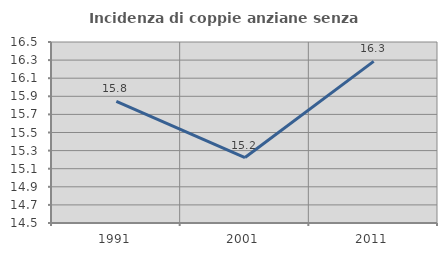
| Category | Incidenza di coppie anziane senza figli  |
|---|---|
| 1991.0 | 15.844 |
| 2001.0 | 15.223 |
| 2011.0 | 16.286 |